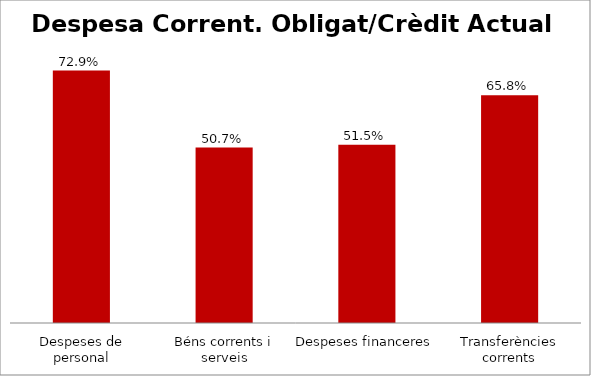
| Category | Series 0 |
|---|---|
| Despeses de personal | 0.729 |
| Béns corrents i serveis | 0.507 |
| Despeses financeres | 0.515 |
| Transferències corrents | 0.658 |